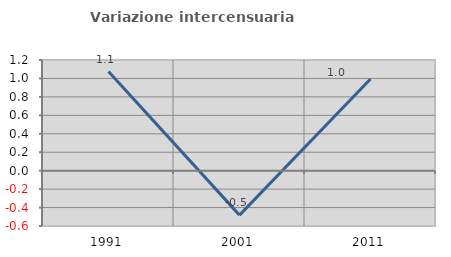
| Category | Variazione intercensuaria annua |
|---|---|
| 1991.0 | 1.075 |
| 2001.0 | -0.482 |
| 2011.0 | 0.994 |